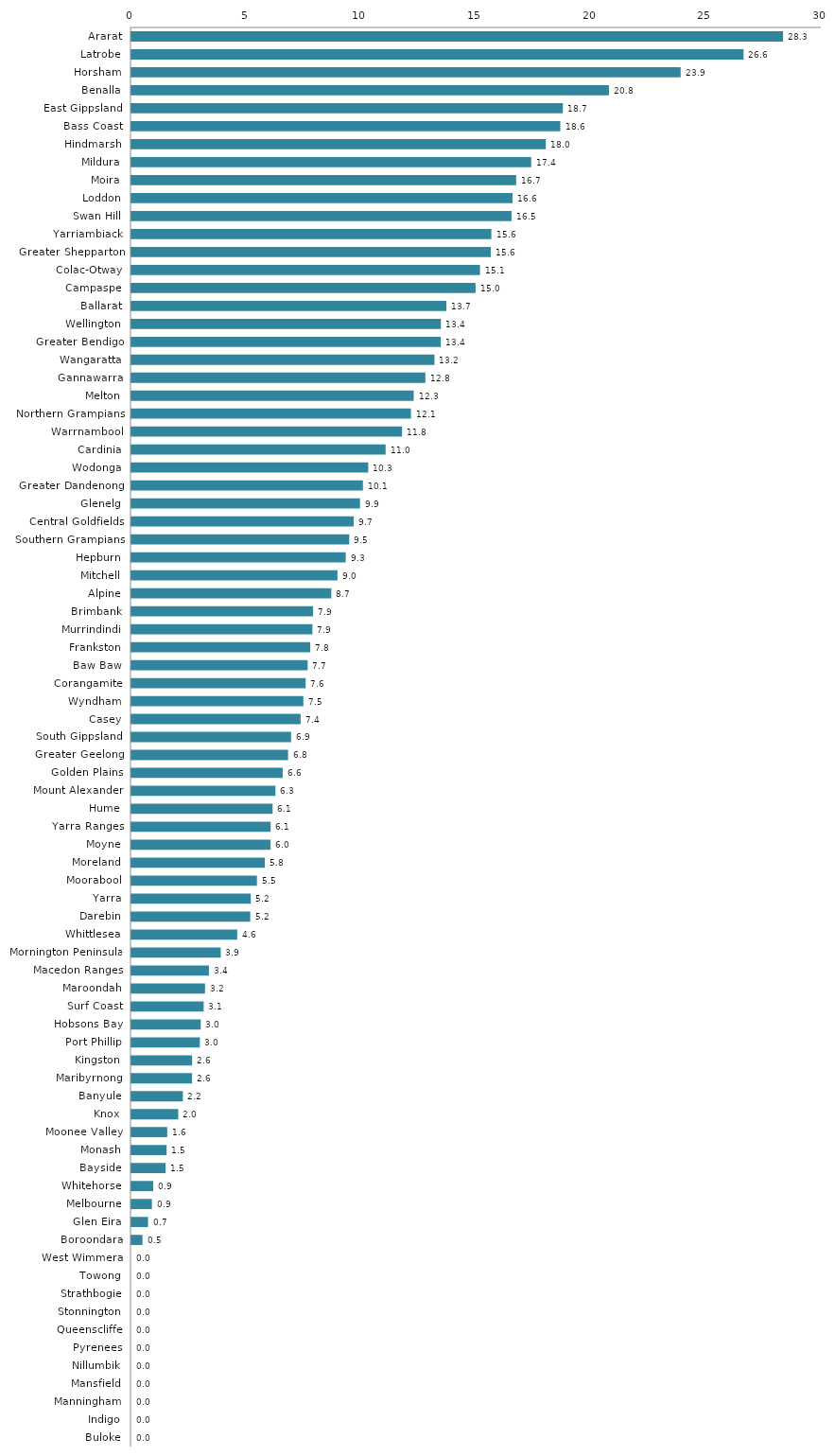
| Category | Series 0 |
|---|---|
| Ararat | 28.318 |
| Latrobe | 26.602 |
| Horsham | 23.868 |
| Benalla | 20.751 |
| East Gippsland | 18.748 |
| Bass Coast | 18.638 |
| Hindmarsh | 18.008 |
| Mildura | 17.372 |
| Moira | 16.719 |
| Loddon | 16.564 |
| Swan Hill | 16.519 |
| Yarriambiack | 15.641 |
| Greater Shepparton | 15.616 |
| Colac-Otway | 15.149 |
| Campaspe | 14.955 |
| Ballarat | 13.686 |
| Wellington | 13.447 |
| Greater Bendigo | 13.446 |
| Wangaratta | 13.168 |
| Gannawarra | 12.775 |
| Melton | 12.267 |
| Northern Grampians | 12.148 |
| Warrnambool | 11.76 |
| Cardinia | 11.046 |
| Wodonga | 10.291 |
| Greater Dandenong | 10.06 |
| Glenelg | 9.932 |
| Central Goldfields | 9.662 |
| Southern Grampians | 9.465 |
| Hepburn | 9.312 |
| Mitchell | 8.954 |
| Alpine | 8.685 |
| Brimbank | 7.894 |
| Murrindindi | 7.864 |
| Frankston | 7.771 |
| Baw Baw | 7.659 |
| Corangamite | 7.573 |
| Wyndham | 7.472 |
| Casey | 7.353 |
| South Gippsland | 6.939 |
| Greater Geelong | 6.809 |
| Golden Plains | 6.573 |
| Mount Alexander | 6.258 |
| Hume | 6.134 |
| Yarra Ranges | 6.05 |
| Moyne | 6.045 |
| Moreland | 5.797 |
| Moorabool | 5.455 |
| Yarra | 5.186 |
| Darebin | 5.163 |
| Whittlesea | 4.597 |
| Mornington Peninsula | 3.88 |
| Macedon Ranges | 3.368 |
| Maroondah | 3.198 |
| Surf Coast | 3.139 |
| Hobsons Bay | 3.012 |
| Port Phillip | 2.973 |
| Kingston | 2.636 |
| Maribyrnong | 2.633 |
| Banyule | 2.235 |
| Knox | 2.033 |
| Moonee Valley | 1.556 |
| Monash | 1.528 |
| Bayside | 1.486 |
| Whitehorse | 0.944 |
| Melbourne | 0.89 |
| Glen Eira | 0.722 |
| Boroondara | 0.48 |
| West Wimmera | 0 |
| Towong | 0 |
| Strathbogie | 0 |
| Stonnington | 0 |
| Queenscliffe | 0 |
| Pyrenees | 0 |
| Nillumbik | 0 |
| Mansfield | 0 |
| Manningham | 0 |
| Indigo | 0 |
| Buloke | 0 |